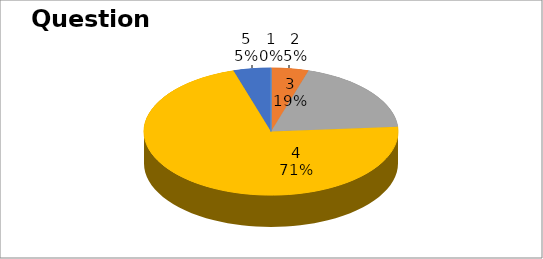
| Category | Series 0 |
|---|---|
| 0 | 0 |
| 1 | 1 |
| 2 | 4 |
| 3 | 15 |
| 4 | 1 |